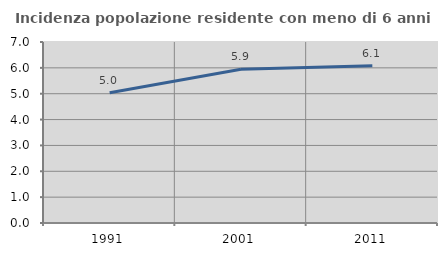
| Category | Incidenza popolazione residente con meno di 6 anni |
|---|---|
| 1991.0 | 5.039 |
| 2001.0 | 5.943 |
| 2011.0 | 6.079 |